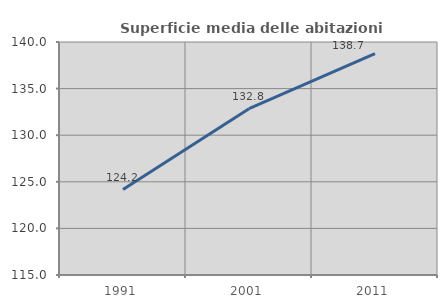
| Category | Superficie media delle abitazioni occupate |
|---|---|
| 1991.0 | 124.166 |
| 2001.0 | 132.846 |
| 2011.0 | 138.747 |